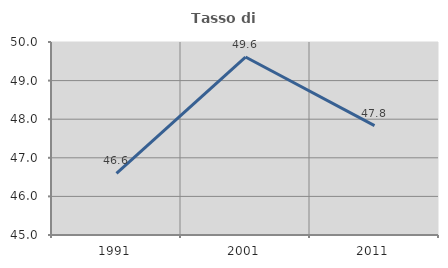
| Category | Tasso di occupazione   |
|---|---|
| 1991.0 | 46.598 |
| 2001.0 | 49.611 |
| 2011.0 | 47.833 |